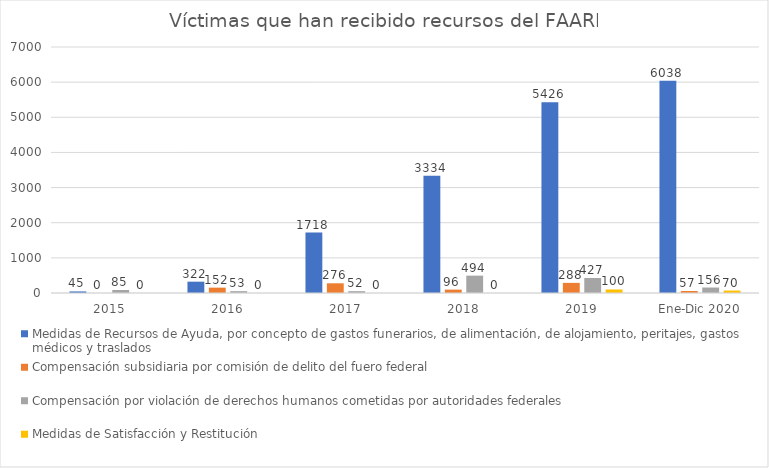
| Category | Medidas de Recursos de Ayuda, por concepto de gastos funerarios, de alimentación, de alojamiento, peritajes, gastos médicos y traslados | Compensación subsidiaria por comisión de delito del fuero federal | Compensación por violación de derechos humanos cometidas por autoridades federales | Medidas de Satisfacción y Restitución |
|---|---|---|---|---|
| 2015 | 45 | 0 | 85 | 0 |
| 2016 | 322 | 152 | 53 | 0 |
| 2017 | 1718 | 276 | 52 | 0 |
| 2018 | 3334 | 96 | 494 | 0 |
| 2019 | 5426 | 288 | 427 | 100 |
| Ene-Dic 2020 | 6038 | 57 | 156 | 70 |